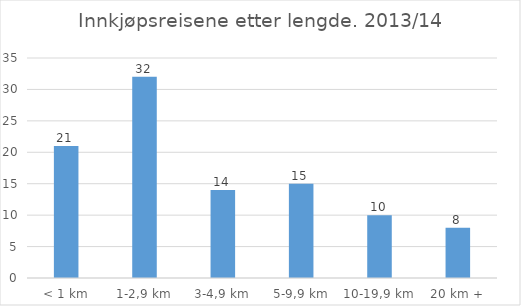
| Category | Andel reiser (i %) |
|---|---|
| < 1 km | 21 |
| 1-2,9 km | 32 |
| 3-4,9 km | 14 |
| 5-9,9 km | 15 |
| 10-19,9 km | 10 |
| 20 km + | 8 |